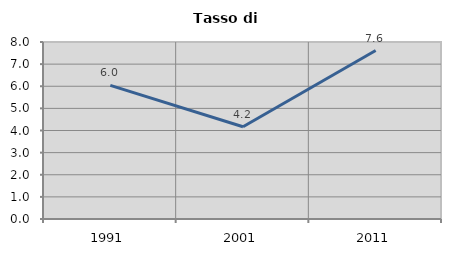
| Category | Tasso di disoccupazione   |
|---|---|
| 1991.0 | 6.039 |
| 2001.0 | 4.17 |
| 2011.0 | 7.613 |